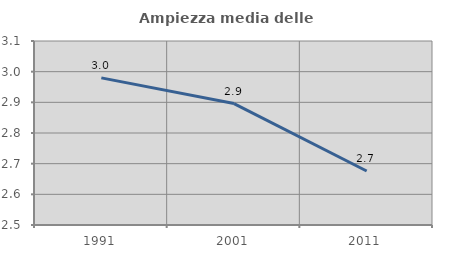
| Category | Ampiezza media delle famiglie |
|---|---|
| 1991.0 | 2.98 |
| 2001.0 | 2.896 |
| 2011.0 | 2.676 |